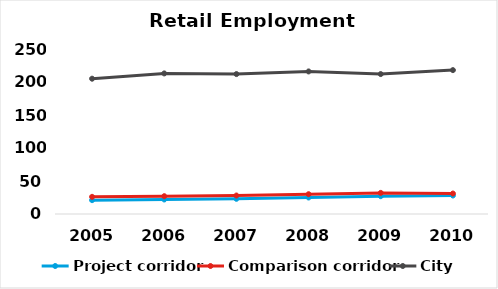
| Category | Project corridor | Comparison corridor | City |
|---|---|---|---|
| 2005.0 | 21 | 26 | 205 |
| 2006.0 | 22 | 27 | 213 |
| 2007.0 | 23 | 28 | 212 |
| 2008.0 | 25 | 30 | 216 |
| 2009.0 | 27 | 32 | 212 |
| 2010.0 | 28 | 31 | 218 |